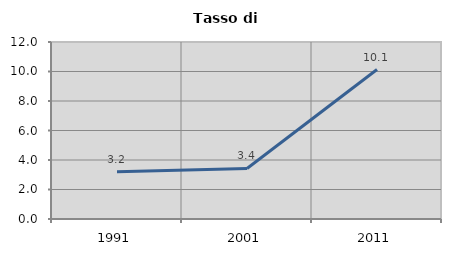
| Category | Tasso di disoccupazione   |
|---|---|
| 1991.0 | 3.205 |
| 2001.0 | 3.425 |
| 2011.0 | 10.135 |